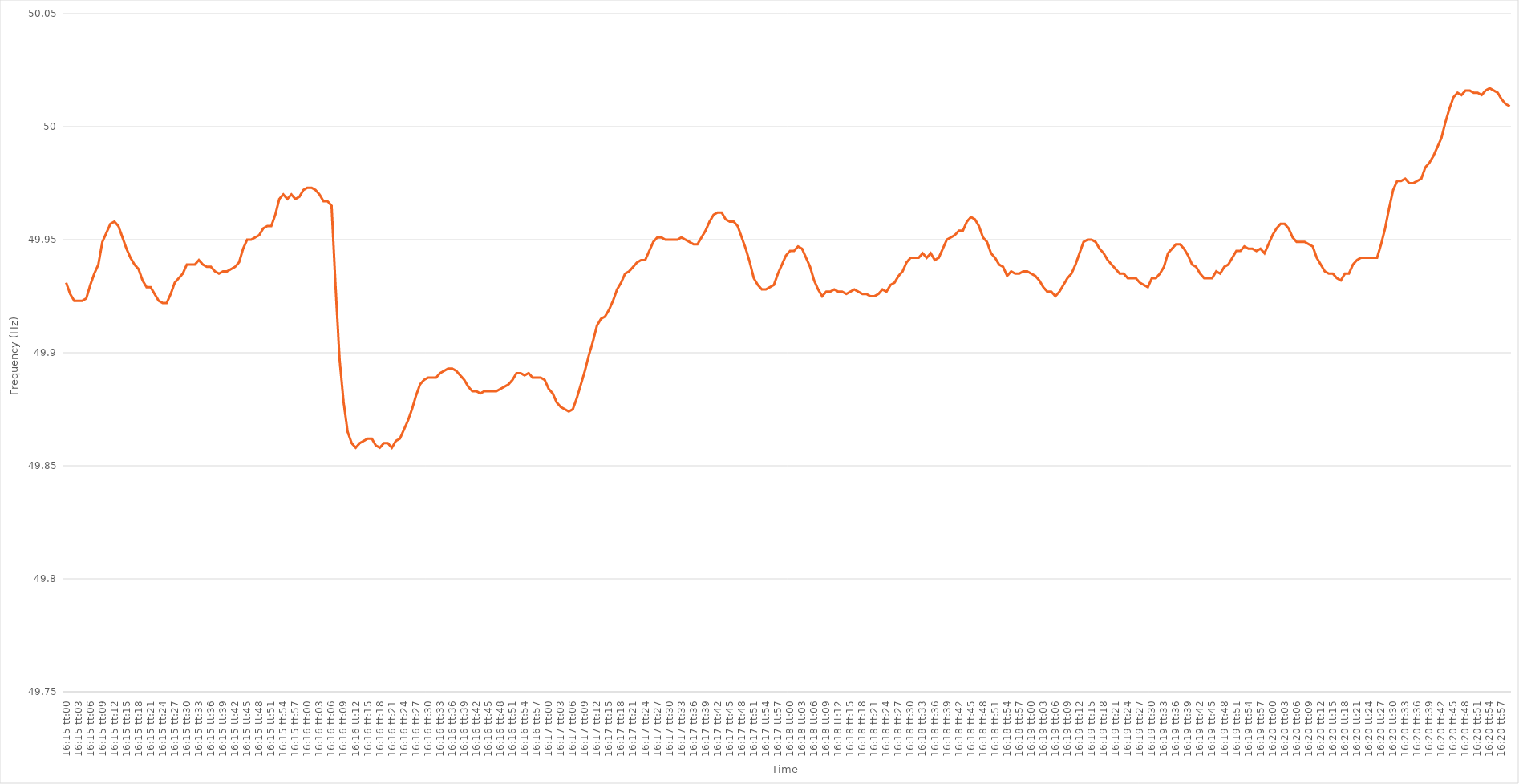
| Category | Series 0 |
|---|---|
| 0.6770833333333334 | 49.931 |
| 0.6770949074074074 | 49.926 |
| 0.6771064814814814 | 49.923 |
| 0.6771180555555555 | 49.923 |
| 0.6771296296296296 | 49.923 |
| 0.6771412037037038 | 49.924 |
| 0.6771527777777777 | 49.93 |
| 0.6771643518518519 | 49.935 |
| 0.6771759259259259 | 49.939 |
| 0.6771875 | 49.949 |
| 0.677199074074074 | 49.953 |
| 0.6772106481481481 | 49.957 |
| 0.6772222222222223 | 49.958 |
| 0.6772337962962963 | 49.956 |
| 0.6772453703703704 | 49.951 |
| 0.6772569444444444 | 49.946 |
| 0.6772685185185185 | 49.942 |
| 0.6772800925925927 | 49.939 |
| 0.6772916666666666 | 49.937 |
| 0.6773032407407408 | 49.932 |
| 0.6773148148148148 | 49.929 |
| 0.6773263888888889 | 49.929 |
| 0.6773379629629629 | 49.926 |
| 0.677349537037037 | 49.923 |
| 0.6773611111111112 | 49.922 |
| 0.6773726851851851 | 49.922 |
| 0.6773842592592593 | 49.926 |
| 0.6773958333333333 | 49.931 |
| 0.6774074074074075 | 49.933 |
| 0.6774189814814814 | 49.935 |
| 0.6774305555555555 | 49.939 |
| 0.6774421296296297 | 49.939 |
| 0.6774537037037037 | 49.939 |
| 0.6774652777777778 | 49.941 |
| 0.6774768518518518 | 49.939 |
| 0.677488425925926 | 49.938 |
| 0.6775000000000001 | 49.938 |
| 0.677511574074074 | 49.936 |
| 0.6775231481481482 | 49.935 |
| 0.6775347222222222 | 49.936 |
| 0.6775462962962964 | 49.936 |
| 0.6775578703703703 | 49.937 |
| 0.6775694444444444 | 49.938 |
| 0.6775810185185186 | 49.94 |
| 0.6775925925925925 | 49.946 |
| 0.6776041666666667 | 49.95 |
| 0.6776157407407407 | 49.95 |
| 0.6776273148148149 | 49.951 |
| 0.6776388888888888 | 49.952 |
| 0.6776504629629629 | 49.955 |
| 0.6776620370370371 | 49.956 |
| 0.6776736111111111 | 49.956 |
| 0.6776851851851852 | 49.961 |
| 0.6776967592592592 | 49.968 |
| 0.6777083333333334 | 49.97 |
| 0.6777199074074075 | 49.968 |
| 0.6777314814814814 | 49.97 |
| 0.6777430555555556 | 49.968 |
| 0.6777546296296296 | 49.969 |
| 0.6777662037037038 | 49.972 |
| 0.6777777777777777 | 49.973 |
| 0.6777893518518519 | 49.973 |
| 0.677800925925926 | 49.972 |
| 0.6778124999999999 | 49.97 |
| 0.6778240740740741 | 49.967 |
| 0.6778356481481481 | 49.967 |
| 0.6778472222222223 | 49.965 |
| 0.6778587962962962 | 49.929 |
| 0.6778703703703703 | 49.897 |
| 0.6778819444444445 | 49.878 |
| 0.6778935185185185 | 49.865 |
| 0.6779050925925926 | 49.86 |
| 0.6779166666666666 | 49.858 |
| 0.6779282407407408 | 49.86 |
| 0.6779398148148149 | 49.861 |
| 0.6779513888888888 | 49.862 |
| 0.677962962962963 | 49.862 |
| 0.677974537037037 | 49.859 |
| 0.6779861111111112 | 49.858 |
| 0.6779976851851851 | 49.86 |
| 0.6780092592592593 | 49.86 |
| 0.6780208333333334 | 49.858 |
| 0.6780324074074073 | 49.861 |
| 0.6780439814814815 | 49.862 |
| 0.6780555555555555 | 49.866 |
| 0.6780671296296297 | 49.87 |
| 0.6780787037037036 | 49.875 |
| 0.6780902777777778 | 49.881 |
| 0.6781018518518519 | 49.886 |
| 0.6781134259259259 | 49.888 |
| 0.678125 | 49.889 |
| 0.678136574074074 | 49.889 |
| 0.6781481481481482 | 49.889 |
| 0.6781597222222223 | 49.891 |
| 0.6781712962962962 | 49.892 |
| 0.6781828703703704 | 49.893 |
| 0.6781944444444444 | 49.893 |
| 0.6782060185185186 | 49.892 |
| 0.6782175925925925 | 49.89 |
| 0.6782291666666667 | 49.888 |
| 0.6782407407407408 | 49.885 |
| 0.6782523148148148 | 49.883 |
| 0.6782638888888889 | 49.883 |
| 0.6782754629629629 | 49.882 |
| 0.6782870370370371 | 49.883 |
| 0.678298611111111 | 49.883 |
| 0.6783101851851852 | 49.883 |
| 0.6783217592592593 | 49.883 |
| 0.6783333333333333 | 49.884 |
| 0.6783449074074074 | 49.885 |
| 0.6783564814814814 | 49.886 |
| 0.6783680555555556 | 49.888 |
| 0.6783796296296297 | 49.891 |
| 0.6783912037037036 | 49.891 |
| 0.6784027777777778 | 49.89 |
| 0.6784143518518518 | 49.891 |
| 0.678425925925926 | 49.889 |
| 0.6784374999999999 | 49.889 |
| 0.6784490740740741 | 49.889 |
| 0.6784606481481482 | 49.888 |
| 0.6784722222222223 | 49.884 |
| 0.6784837962962963 | 49.882 |
| 0.6784953703703703 | 49.878 |
| 0.6785069444444445 | 49.876 |
| 0.6785185185185184 | 49.875 |
| 0.6785300925925926 | 49.874 |
| 0.6785416666666667 | 49.875 |
| 0.6785532407407407 | 49.88 |
| 0.6785648148148148 | 49.886 |
| 0.6785763888888888 | 49.892 |
| 0.678587962962963 | 49.899 |
| 0.6785995370370371 | 49.905 |
| 0.678611111111111 | 49.912 |
| 0.6786226851851852 | 49.915 |
| 0.6786342592592592 | 49.916 |
| 0.6786458333333334 | 49.919 |
| 0.6786574074074073 | 49.923 |
| 0.6786689814814815 | 49.928 |
| 0.6786805555555556 | 49.931 |
| 0.6786921296296297 | 49.935 |
| 0.6787037037037037 | 49.936 |
| 0.6787152777777777 | 49.938 |
| 0.6787268518518519 | 49.94 |
| 0.678738425925926 | 49.941 |
| 0.67875 | 49.941 |
| 0.6787615740740741 | 49.945 |
| 0.6787731481481482 | 49.949 |
| 0.6787847222222222 | 49.951 |
| 0.6787962962962962 | 49.951 |
| 0.6788078703703704 | 49.95 |
| 0.6788194444444445 | 49.95 |
| 0.6788310185185185 | 49.95 |
| 0.6788425925925926 | 49.95 |
| 0.6788541666666666 | 49.951 |
| 0.6788657407407408 | 49.95 |
| 0.6788773148148147 | 49.949 |
| 0.6788888888888889 | 49.948 |
| 0.678900462962963 | 49.948 |
| 0.6789120370370371 | 49.951 |
| 0.6789236111111111 | 49.954 |
| 0.6789351851851851 | 49.958 |
| 0.6789467592592593 | 49.961 |
| 0.6789583333333334 | 49.962 |
| 0.6789699074074074 | 49.962 |
| 0.6789814814814815 | 49.959 |
| 0.6789930555555556 | 49.958 |
| 0.6790046296296296 | 49.958 |
| 0.6790162037037036 | 49.956 |
| 0.6790277777777778 | 49.951 |
| 0.6790393518518519 | 49.946 |
| 0.6790509259259259 | 49.94 |
| 0.6790625 | 49.933 |
| 0.679074074074074 | 49.93 |
| 0.6790856481481482 | 49.928 |
| 0.6790972222222221 | 49.928 |
| 0.6791087962962963 | 49.929 |
| 0.6791203703703704 | 49.93 |
| 0.6791319444444445 | 49.935 |
| 0.6791435185185185 | 49.939 |
| 0.6791550925925925 | 49.943 |
| 0.6791666666666667 | 49.945 |
| 0.6791782407407408 | 49.945 |
| 0.6791898148148148 | 49.947 |
| 0.6792013888888889 | 49.946 |
| 0.679212962962963 | 49.942 |
| 0.679224537037037 | 49.938 |
| 0.679236111111111 | 49.932 |
| 0.6792476851851852 | 49.928 |
| 0.6792592592592593 | 49.925 |
| 0.6792708333333333 | 49.927 |
| 0.6792824074074074 | 49.927 |
| 0.6792939814814815 | 49.928 |
| 0.6793055555555556 | 49.927 |
| 0.6793171296296295 | 49.927 |
| 0.6793287037037037 | 49.926 |
| 0.6793402777777778 | 49.927 |
| 0.6793518518518519 | 49.928 |
| 0.6793634259259259 | 49.927 |
| 0.679375 | 49.926 |
| 0.6793865740740741 | 49.926 |
| 0.6793981481481483 | 49.925 |
| 0.6794097222222222 | 49.925 |
| 0.6794212962962963 | 49.926 |
| 0.6794328703703704 | 49.928 |
| 0.6794444444444444 | 49.927 |
| 0.6794560185185184 | 49.93 |
| 0.6794675925925926 | 49.931 |
| 0.6794791666666667 | 49.934 |
| 0.6794907407407407 | 49.936 |
| 0.6795023148148148 | 49.94 |
| 0.6795138888888889 | 49.942 |
| 0.679525462962963 | 49.942 |
| 0.6795370370370369 | 49.942 |
| 0.6795486111111111 | 49.944 |
| 0.6795601851851852 | 49.942 |
| 0.6795717592592593 | 49.944 |
| 0.6795833333333333 | 49.941 |
| 0.6795949074074074 | 49.942 |
| 0.6796064814814815 | 49.946 |
| 0.6796180555555557 | 49.95 |
| 0.6796296296296296 | 49.951 |
| 0.6796412037037037 | 49.952 |
| 0.6796527777777778 | 49.954 |
| 0.6796643518518519 | 49.954 |
| 0.6796759259259259 | 49.958 |
| 0.6796875 | 49.96 |
| 0.6796990740740741 | 49.959 |
| 0.6797106481481481 | 49.956 |
| 0.6797222222222222 | 49.951 |
| 0.6797337962962963 | 49.949 |
| 0.6797453703703704 | 49.944 |
| 0.6797569444444443 | 49.942 |
| 0.6797685185185185 | 49.939 |
| 0.6797800925925926 | 49.938 |
| 0.6797916666666667 | 49.934 |
| 0.6798032407407407 | 49.936 |
| 0.6798148148148148 | 49.935 |
| 0.6798263888888889 | 49.935 |
| 0.6798379629629631 | 49.936 |
| 0.679849537037037 | 49.936 |
| 0.6798611111111111 | 49.935 |
| 0.6798726851851852 | 49.934 |
| 0.6798842592592593 | 49.932 |
| 0.6798958333333333 | 49.929 |
| 0.6799074074074074 | 49.927 |
| 0.6799189814814816 | 49.927 |
| 0.6799305555555556 | 49.925 |
| 0.6799421296296296 | 49.927 |
| 0.6799537037037037 | 49.93 |
| 0.6799652777777778 | 49.933 |
| 0.6799768518518517 | 49.935 |
| 0.6799884259259259 | 49.939 |
| 0.68 | 49.944 |
| 0.6800115740740741 | 49.949 |
| 0.6800231481481481 | 49.95 |
| 0.6800347222222222 | 49.95 |
| 0.6800462962962963 | 49.949 |
| 0.6800578703703705 | 49.946 |
| 0.6800694444444444 | 49.944 |
| 0.6800810185185185 | 49.941 |
| 0.6800925925925926 | 49.939 |
| 0.6801041666666667 | 49.937 |
| 0.6801157407407407 | 49.935 |
| 0.6801273148148148 | 49.935 |
| 0.680138888888889 | 49.933 |
| 0.680150462962963 | 49.933 |
| 0.680162037037037 | 49.933 |
| 0.6801736111111111 | 49.931 |
| 0.6801851851851852 | 49.93 |
| 0.6801967592592592 | 49.929 |
| 0.6802083333333333 | 49.933 |
| 0.6802199074074075 | 49.933 |
| 0.6802314814814815 | 49.935 |
| 0.6802430555555555 | 49.938 |
| 0.6802546296296296 | 49.944 |
| 0.6802662037037037 | 49.946 |
| 0.6802777777777779 | 49.948 |
| 0.6802893518518518 | 49.948 |
| 0.680300925925926 | 49.946 |
| 0.6803125 | 49.943 |
| 0.6803240740740741 | 49.939 |
| 0.6803356481481481 | 49.938 |
| 0.6803472222222222 | 49.935 |
| 0.6803587962962964 | 49.933 |
| 0.6803703703703704 | 49.933 |
| 0.6803819444444444 | 49.933 |
| 0.6803935185185185 | 49.936 |
| 0.6804050925925926 | 49.935 |
| 0.6804166666666666 | 49.938 |
| 0.6804282407407407 | 49.939 |
| 0.6804398148148149 | 49.942 |
| 0.6804513888888889 | 49.945 |
| 0.6804629629629629 | 49.945 |
| 0.680474537037037 | 49.947 |
| 0.6804861111111111 | 49.946 |
| 0.6804976851851853 | 49.946 |
| 0.6805092592592592 | 49.945 |
| 0.6805208333333334 | 49.946 |
| 0.6805324074074074 | 49.944 |
| 0.6805439814814815 | 49.948 |
| 0.6805555555555555 | 49.952 |
| 0.6805671296296296 | 49.955 |
| 0.6805787037037038 | 49.957 |
| 0.6805902777777778 | 49.957 |
| 0.6806018518518518 | 49.955 |
| 0.6806134259259259 | 49.951 |
| 0.680625 | 49.949 |
| 0.680636574074074 | 49.949 |
| 0.6806481481481481 | 49.949 |
| 0.6806597222222223 | 49.948 |
| 0.6806712962962963 | 49.947 |
| 0.6806828703703703 | 49.942 |
| 0.6806944444444444 | 49.939 |
| 0.6807060185185185 | 49.936 |
| 0.6807175925925927 | 49.935 |
| 0.6807291666666666 | 49.935 |
| 0.6807407407407408 | 49.933 |
| 0.6807523148148148 | 49.932 |
| 0.680763888888889 | 49.935 |
| 0.6807754629629629 | 49.935 |
| 0.680787037037037 | 49.939 |
| 0.6807986111111112 | 49.941 |
| 0.6808101851851852 | 49.942 |
| 0.6808217592592593 | 49.942 |
| 0.6808333333333333 | 49.942 |
| 0.6808449074074074 | 49.942 |
| 0.6808564814814816 | 49.942 |
| 0.6808680555555555 | 49.948 |
| 0.6808796296296297 | 49.955 |
| 0.6808912037037037 | 49.964 |
| 0.6809027777777777 | 49.972 |
| 0.6809143518518518 | 49.976 |
| 0.6809259259259259 | 49.976 |
| 0.6809375000000001 | 49.977 |
| 0.680949074074074 | 49.975 |
| 0.6809606481481482 | 49.975 |
| 0.6809722222222222 | 49.976 |
| 0.6809837962962964 | 49.977 |
| 0.6809953703703703 | 49.982 |
| 0.6810069444444444 | 49.984 |
| 0.6810185185185186 | 49.987 |
| 0.6810300925925926 | 49.991 |
| 0.6810416666666667 | 49.995 |
| 0.6810532407407407 | 50.002 |
| 0.6810648148148148 | 50.008 |
| 0.681076388888889 | 50.013 |
| 0.6810879629629629 | 50.015 |
| 0.6810995370370371 | 50.014 |
| 0.6811111111111111 | 50.016 |
| 0.6811226851851852 | 50.016 |
| 0.6811342592592592 | 50.015 |
| 0.6811458333333333 | 50.015 |
| 0.6811574074074075 | 50.014 |
| 0.6811689814814814 | 50.016 |
| 0.6811805555555556 | 50.017 |
| 0.6811921296296296 | 50.016 |
| 0.6812037037037038 | 50.015 |
| 0.6812152777777777 | 50.012 |
| 0.6812268518518518 | 50.01 |
| 0.681238425925926 | 50.009 |